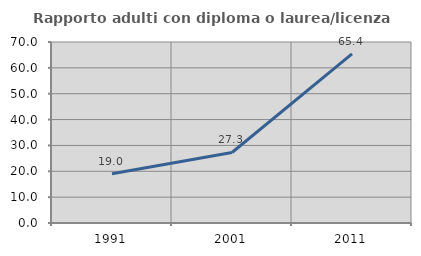
| Category | Rapporto adulti con diploma o laurea/licenza media  |
|---|---|
| 1991.0 | 19.048 |
| 2001.0 | 27.273 |
| 2011.0 | 65.385 |